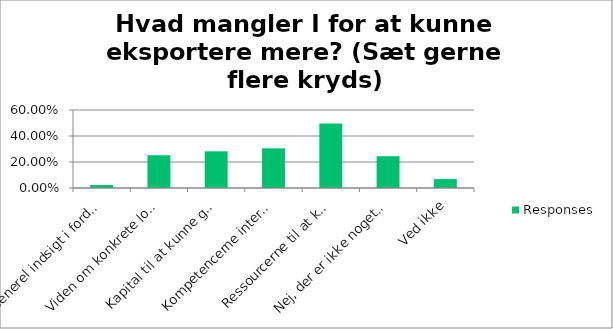
| Category | Responses |
|---|---|
| Generel indsigt i fordelene ved eksport | 0.023 |
| Viden om konkrete lokalmarkeder | 0.252 |
| Kapital til at kunne gå ind på nye markeder | 0.282 |
| Kompetencerne internt til at kunne gå på nye markeder | 0.305 |
| Ressourcerne til at kunne fokusere på (yderligere) eksport | 0.496 |
| Nej, der er ikke noget, der forhindrer os i (yderligere) eksport | 0.244 |
| Ved ikke | 0.069 |